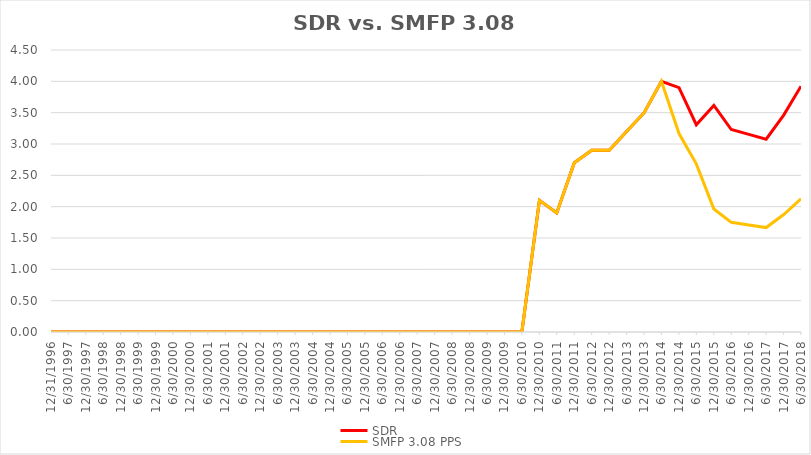
| Category | SDR | SMFP 3.08 PPS |
|---|---|---|
| 12/31/96 | 0 | 0 |
| 6/30/97 | 0 | 0 |
| 12/31/97 | 0 | 0 |
| 6/30/98 | 0 | 0 |
| 12/31/98 | 0 | 0 |
| 6/30/99 | 0 | 0 |
| 12/31/99 | 0 | 0 |
| 6/30/00 | 0 | 0 |
| 12/31/00 | 0 | 0 |
| 6/30/01 | 0 | 0 |
| 12/31/01 | 0 | 0 |
| 6/30/02 | 0 | 0 |
| 12/31/02 | 0 | 0 |
| 6/30/03 | 0 | 0 |
| 12/31/03 | 0 | 0 |
| 6/30/04 | 0 | 0 |
| 12/31/04 | 0 | 0 |
| 6/30/05 | 0 | 0 |
| 12/31/05 | 0 | 0 |
| 6/30/06 | 0 | 0 |
| 12/31/06 | 0 | 0 |
| 6/30/07 | 0 | 0 |
| 12/31/07 | 0 | 0 |
| 6/30/08 | 0 | 0 |
| 12/31/08 | 0 | 0 |
| 6/30/09 | 0 | 0 |
| 12/31/09 | 0 | 0 |
| 6/30/10 | 0 | 0 |
| 12/31/10 | 2.1 | 2.1 |
| 6/30/11 | 1.9 | 1.9 |
| 12/31/11 | 2.7 | 2.7 |
| 6/30/12 | 2.9 | 2.9 |
| 12/31/12 | 2.9 | 2.9 |
| 6/30/13 | 3.2 | 3.2 |
| 12/31/13 | 3.5 | 3.5 |
| 6/30/14 | 4 | 4 |
| 12/31/14 | 3.9 | 3.167 |
| 6/30/15 | 3.308 | 2.683 |
| 12/31/15 | 3.615 | 1.963 |
| 6/30/16 | 3.231 | 1.75 |
| 12/31/16 | 3.154 | 1.708 |
| 6/30/17 | 3.077 | 1.667 |
| 12/31/17 | 3.462 | 1.875 |
| 6/30/18 | 3.923 | 2.125 |